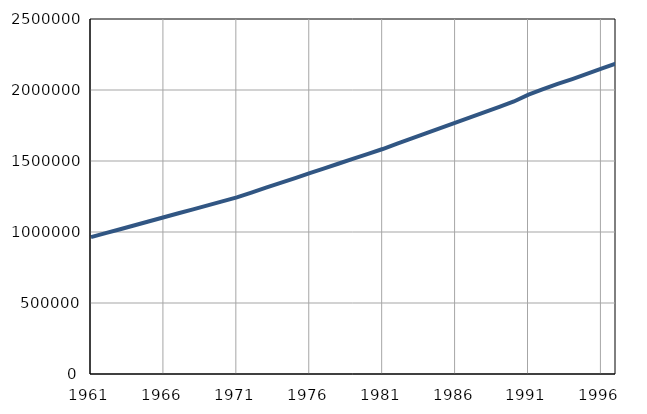
| Category | Број
становника |
|---|---|
| 1961.0 | 963715 |
| 1962.0 | 991725 |
| 1963.0 | 1019735 |
| 1964.0 | 1047745 |
| 1965.0 | 1075755 |
| 1966.0 | 1103765 |
| 1967.0 | 1131775 |
| 1968.0 | 1159785 |
| 1969.0 | 1187795 |
| 1970.0 | 1215805 |
| 1971.0 | 1243811 |
| 1972.0 | 1277879 |
| 1973.0 | 1311947 |
| 1974.0 | 1346015 |
| 1975.0 | 1380083 |
| 1976.0 | 1414151 |
| 1977.0 | 1448219 |
| 1978.0 | 1482287 |
| 1979.0 | 1516355 |
| 1980.0 | 1550423 |
| 1981.0 | 1584440 |
| 1982.0 | 1621616 |
| 1983.0 | 1658792 |
| 1984.0 | 1695968 |
| 1985.0 | 1733144 |
| 1986.0 | 1770320 |
| 1987.0 | 1807496 |
| 1988.0 | 1844672 |
| 1989.0 | 1881848 |
| 1990.0 | 1919024 |
| 1991.0 | 1967000 |
| 1992.0 | 2006000 |
| 1993.0 | 2043000 |
| 1994.0 | 2077000 |
| 1995.0 | 2113000 |
| 1996.0 | 2151000 |
| 1997.0 | 2186000 |